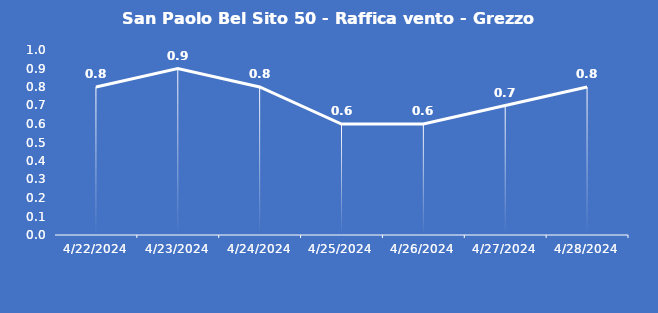
| Category | San Paolo Bel Sito 50 - Raffica vento - Grezzo (m/s) |
|---|---|
| 4/22/24 | 0.8 |
| 4/23/24 | 0.9 |
| 4/24/24 | 0.8 |
| 4/25/24 | 0.6 |
| 4/26/24 | 0.6 |
| 4/27/24 | 0.7 |
| 4/28/24 | 0.8 |